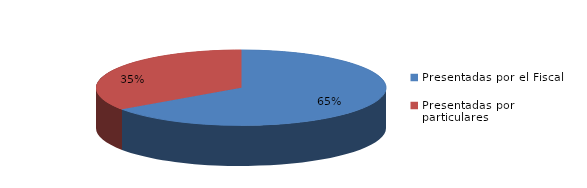
| Category | Series 0 |
|---|---|
| Presentadas por el Fiscal | 64 |
| Presentadas por particulares | 34 |